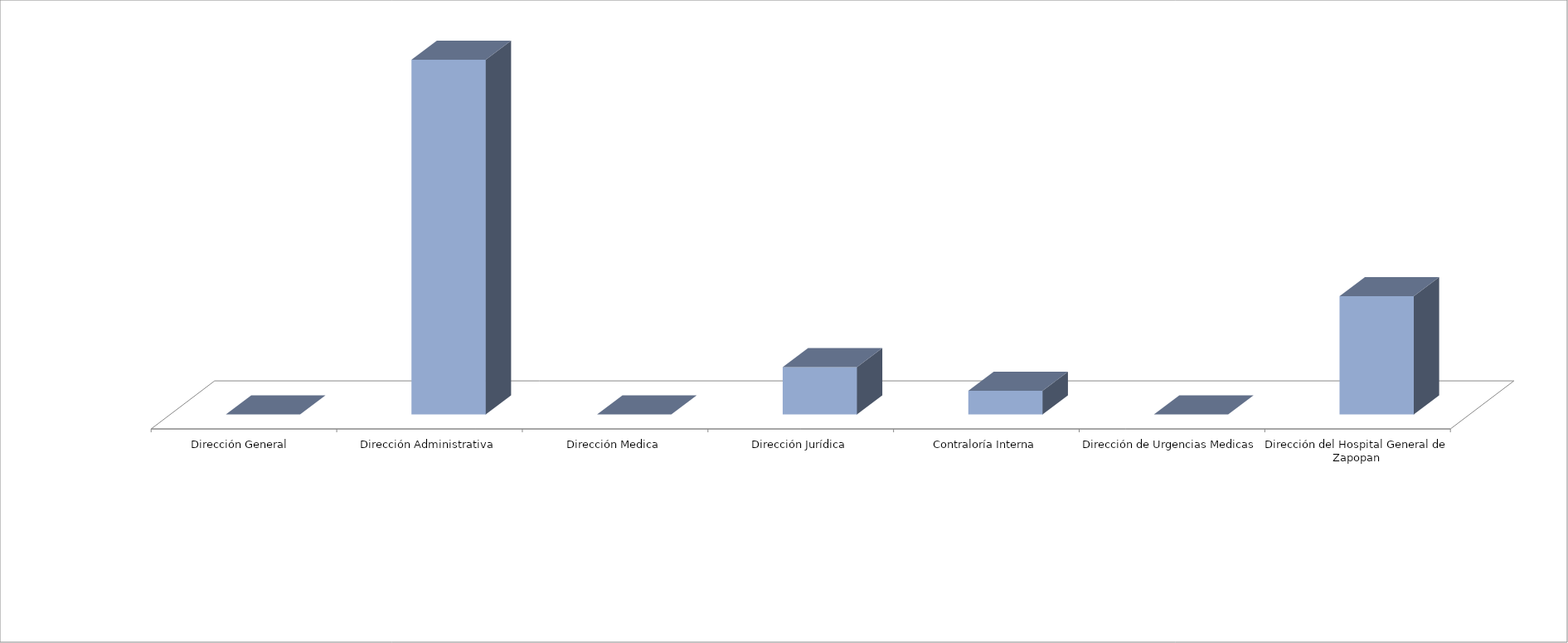
| Category | Series 0 | Series 1 |
|---|---|---|
| Dirección General  |  | 0 |
| Dirección Administrativa |  | 15 |
| Dirección Medica |  | 0 |
| Dirección Jurídica |  | 2 |
| Contraloría Interna |  | 1 |
| Dirección de Urgencias Medicas |  | 0 |
| Dirección del Hospital General de Zapopan |  | 5 |